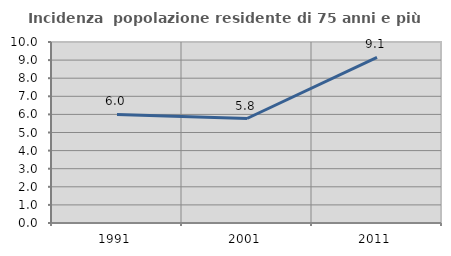
| Category | Incidenza  popolazione residente di 75 anni e più |
|---|---|
| 1991.0 | 5.997 |
| 2001.0 | 5.773 |
| 2011.0 | 9.149 |